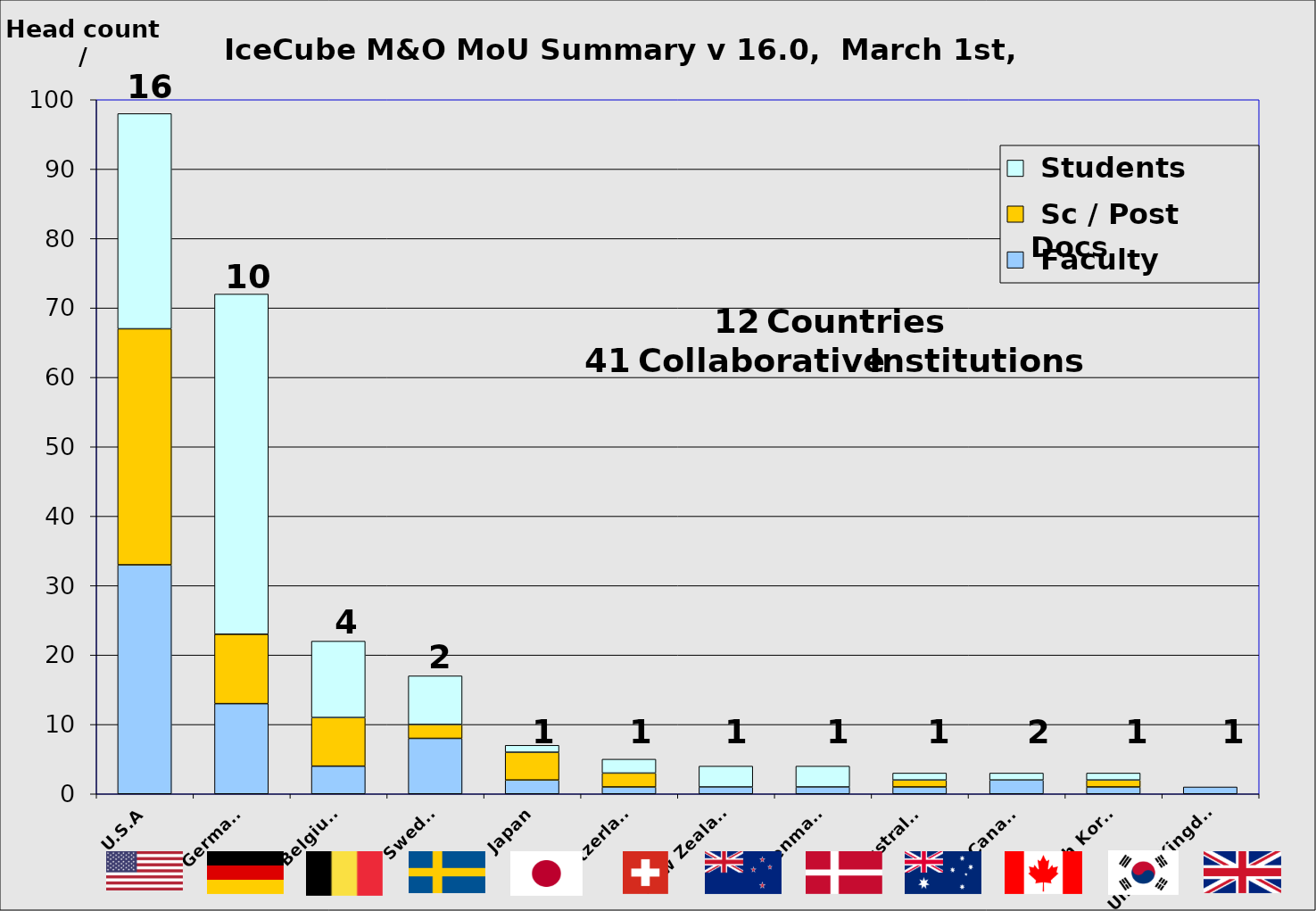
| Category |  Faculty |  Sc / Post Docs |  Students |
|---|---|---|---|
| U.S.A | 33 | 34 | 31 |
| Germany | 13 | 10 | 49 |
| Belgium | 4 | 7 | 11 |
| Sweden | 8 | 2 | 7 |
| Japan | 2 | 4 | 1 |
| Switzerland | 1 | 2 | 2 |
| New Zealand | 1 | 0 | 3 |
| Denmark | 1 | 0 | 3 |
| Australia | 1 | 1 | 1 |
| Canada | 2 | 0 | 1 |
| South Korea | 1 | 1 | 1 |
| United Kingdom | 1 | 0 | 0 |